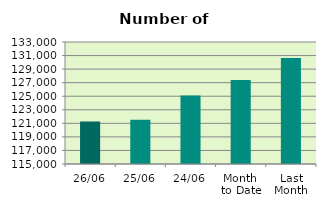
| Category | Series 0 |
|---|---|
| 26/06 | 121282 |
| 25/06 | 121536 |
| 24/06 | 125122 |
| Month 
to Date | 127404.111 |
| Last
Month | 130647.636 |